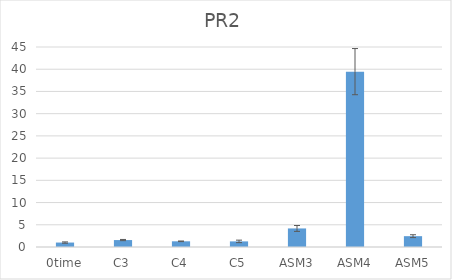
| Category | Series 0 |
|---|---|
| 0time | 1 |
| C3 | 1.561 |
| C4 | 1.282 |
| C5 | 1.263 |
| ASM3 | 4.176 |
| ASM4 | 39.458 |
| ASM5 | 2.437 |